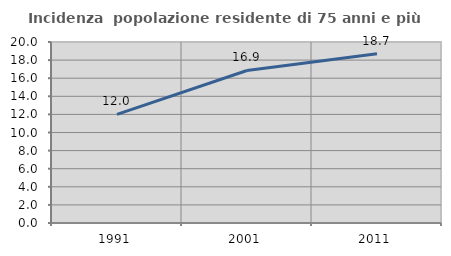
| Category | Incidenza  popolazione residente di 75 anni e più |
|---|---|
| 1991.0 | 12 |
| 2001.0 | 16.854 |
| 2011.0 | 18.699 |